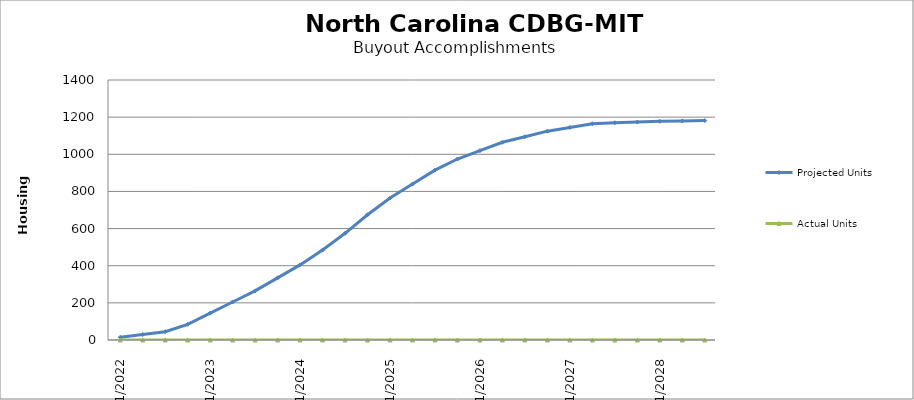
| Category | Projected Units | Actual Units |
|---|---|---|
| 01/2022 | 14.5 | 0 |
| 04/2022 | 29.5 | 0 |
| 07/2022 | 44.5 | 0 |
| 10/2022 | 84.5 | 0 |
| 01/2023 | 144.5 | 0 |
| 04/2023 | 204.5 | 0 |
| 07/2023 | 264.5 | 0 |
| 10/2023 | 334.5 | 0 |
| 01/2024 | 404.5 | 0 |
| 04/2024 | 484.5 | 0 |
| 07/2024 | 574.5 | 0 |
| 10/2024 | 674.5 | 0 |
| 01/2025 | 764.5 | 0 |
| 04/2025 | 839.5 | 0 |
| 07/2025 | 914.5 | 0 |
| 10/2025 | 974.5 | 0 |
| 01/2026 | 1019.5 | 0 |
| 04/2026 | 1064.5 | 0 |
| 07/2026 | 1094.5 | 0 |
| 10/2026 | 1124.5 | 0 |
| 01/2027 | 1144.5 | 0 |
| 04/2027 | 1164.5 | 0 |
| 07/2027 | 1169.5 | 0 |
| 10/2027 | 1173.5 | 0 |
| 01/2028 | 1177.5 | 0 |
| 04/2028 | 1179.5 | 0 |
| 07/2028 | 1181.5 | 0 |